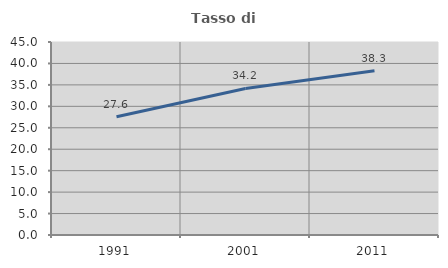
| Category | Tasso di occupazione   |
|---|---|
| 1991.0 | 27.59 |
| 2001.0 | 34.174 |
| 2011.0 | 38.277 |